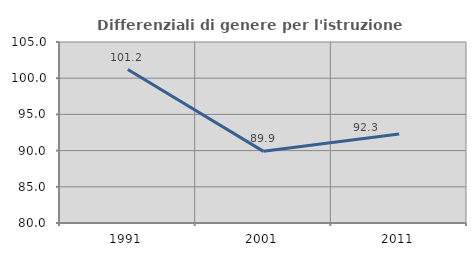
| Category | Differenziali di genere per l'istruzione superiore |
|---|---|
| 1991.0 | 101.202 |
| 2001.0 | 89.897 |
| 2011.0 | 92.287 |